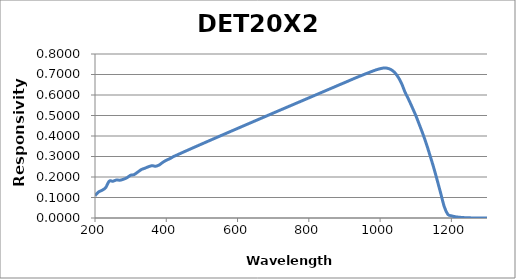
| Category | Responsivity (A/W) |
|---|---|
| 200.0 | 0.109 |
| 210.0 | 0.127 |
| 220.0 | 0.135 |
| 230.0 | 0.148 |
| 240.0 | 0.18 |
| 250.0 | 0.179 |
| 260.0 | 0.185 |
| 270.0 | 0.184 |
| 280.0 | 0.189 |
| 290.0 | 0.197 |
| 300.0 | 0.209 |
| 310.0 | 0.212 |
| 320.0 | 0.224 |
| 330.0 | 0.236 |
| 340.0 | 0.243 |
| 350.0 | 0.25 |
| 360.0 | 0.255 |
| 370.0 | 0.252 |
| 380.0 | 0.259 |
| 390.0 | 0.271 |
| 400.0 | 0.282 |
| 410.0 | 0.289 |
| 420.0 | 0.299 |
| 430.0 | 0.307 |
| 440.0 | 0.315 |
| 450.0 | 0.323 |
| 460.0 | 0.331 |
| 470.0 | 0.338 |
| 480.0 | 0.346 |
| 490.0 | 0.354 |
| 500.0 | 0.361 |
| 510.0 | 0.369 |
| 520.0 | 0.377 |
| 530.0 | 0.384 |
| 540.0 | 0.392 |
| 550.0 | 0.399 |
| 560.0 | 0.407 |
| 570.0 | 0.414 |
| 580.0 | 0.422 |
| 590.0 | 0.429 |
| 600.0 | 0.437 |
| 610.0 | 0.444 |
| 620.0 | 0.452 |
| 630.0 | 0.459 |
| 640.0 | 0.467 |
| 650.0 | 0.474 |
| 660.0 | 0.482 |
| 670.0 | 0.489 |
| 680.0 | 0.497 |
| 690.0 | 0.504 |
| 700.0 | 0.512 |
| 710.0 | 0.519 |
| 720.0 | 0.527 |
| 730.0 | 0.534 |
| 740.0 | 0.541 |
| 750.0 | 0.549 |
| 760.0 | 0.556 |
| 770.0 | 0.564 |
| 780.0 | 0.571 |
| 790.0 | 0.578 |
| 800.0 | 0.586 |
| 810.0 | 0.593 |
| 820.0 | 0.601 |
| 830.0 | 0.608 |
| 840.0 | 0.616 |
| 850.0 | 0.623 |
| 860.0 | 0.631 |
| 870.0 | 0.638 |
| 880.0 | 0.645 |
| 890.0 | 0.653 |
| 900.0 | 0.66 |
| 910.0 | 0.668 |
| 920.0 | 0.675 |
| 930.0 | 0.683 |
| 940.0 | 0.69 |
| 950.0 | 0.697 |
| 960.0 | 0.704 |
| 970.0 | 0.71 |
| 980.0 | 0.717 |
| 990.0 | 0.723 |
| 1000.0 | 0.728 |
| 1010.0 | 0.732 |
| 1020.0 | 0.731 |
| 1030.0 | 0.724 |
| 1040.0 | 0.711 |
| 1050.0 | 0.689 |
| 1060.0 | 0.657 |
| 1070.0 | 0.614 |
| 1080.0 | 0.578 |
| 1090.0 | 0.54 |
| 1100.0 | 0.501 |
| 1110.0 | 0.456 |
| 1120.0 | 0.411 |
| 1130.0 | 0.361 |
| 1140.0 | 0.305 |
| 1150.0 | 0.248 |
| 1160.0 | 0.186 |
| 1170.0 | 0.121 |
| 1180.0 | 0.056 |
| 1190.0 | 0.018 |
| 1200.0 | 0.011 |
| 1210.0 | 0.006 |
| 1220.0 | 0.004 |
| 1230.0 | 0.002 |
| 1240.0 | 0.001 |
| 1250.0 | 0.001 |
| 1260.0 | 0 |
| 1270.0 | 0 |
| 1280.0 | 0 |
| 1290.0 | 0 |
| 1300.0 | 0 |